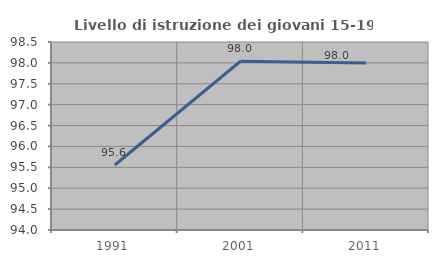
| Category | Livello di istruzione dei giovani 15-19 anni |
|---|---|
| 1991.0 | 95.556 |
| 2001.0 | 98.039 |
| 2011.0 | 98 |